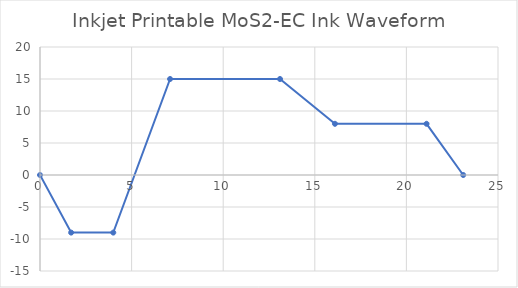
| Category | Voltage (V) |
|---|---|
| 0.0 | 0 |
| 1.7 | -9 |
| 4.0 | -9 |
| 7.1 | 15 |
| 13.1 | 15 |
| 16.1 | 8 |
| 21.1 | 8 |
| 23.1 | 0 |